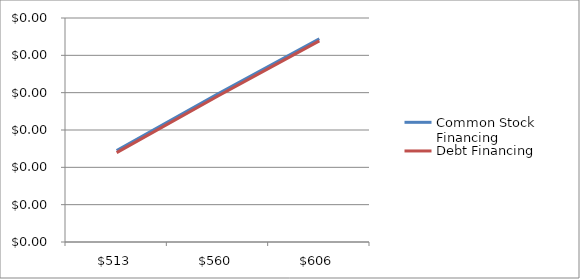
| Category | Common Stock Financing | Debt Financing |
|---|---|---|
| 512.7 | 0 | 0 |
| 560.0 | 0 | 0 |
| 606.0 | 0 | 0 |